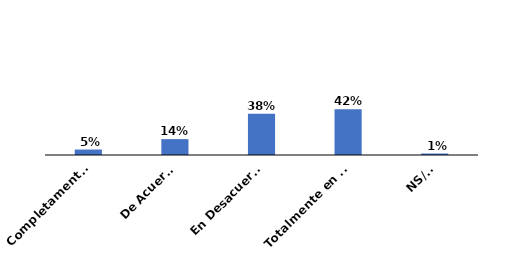
| Category | Series 0 |
|---|---|
| Completamente de acuerdo | 0.05 |
| De Acuerdo | 0.144 |
| En Desacuerdo | 0.376 |
| Totalmente en desacuerdo | 0.417 |
| NS/NR | 0.014 |